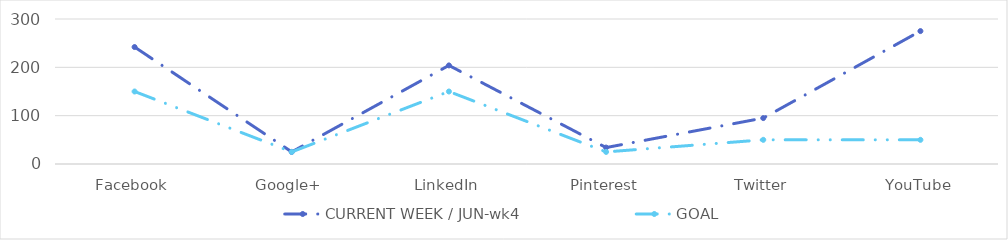
| Category | CURRENT WEEK / JUN-wk4 | GOAL |
|---|---|---|
| Facebook | 242 | 150 |
| Google+ | 25 | 25 |
| LinkedIn | 204 | 150 |
| Pinterest | 34 | 25 |
| Twitter | 95 | 50 |
| YouTube | 275 | 50 |